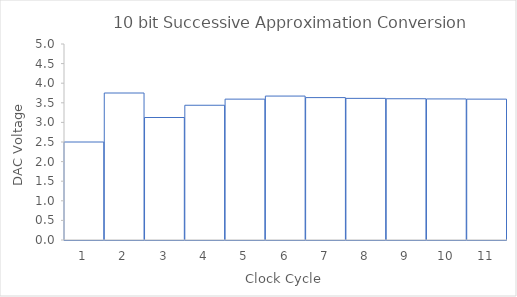
| Category | Series 1 |
|---|---|
| 0 | 2.5 |
| 1 | 3.75 |
| 2 | 3.125 |
| 3 | 3.438 |
| 4 | 3.594 |
| 5 | 3.672 |
| 6 | 3.633 |
| 7 | 3.613 |
| 8 | 3.604 |
| 9 | 3.599 |
| 10 | 3.594 |